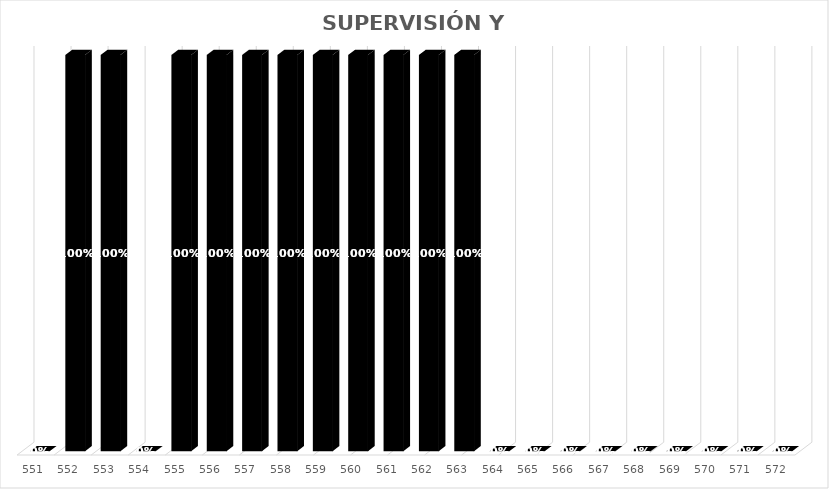
| Category | % Avance |
|---|---|
| 551.0 | 0 |
| 552.0 | 1 |
| 553.0 | 1 |
| 554.0 | 0 |
| 555.0 | 1 |
| 556.0 | 1 |
| 557.0 | 1 |
| 558.0 | 1 |
| 559.0 | 1 |
| 560.0 | 1 |
| 561.0 | 1 |
| 562.0 | 1 |
| 563.0 | 1 |
| 564.0 | 0 |
| 565.0 | 0 |
| 566.0 | 0 |
| 567.0 | 0 |
| 568.0 | 0 |
| 569.0 | 0 |
| 570.0 | 0 |
| 571.0 | 0 |
| 572.0 | 0 |